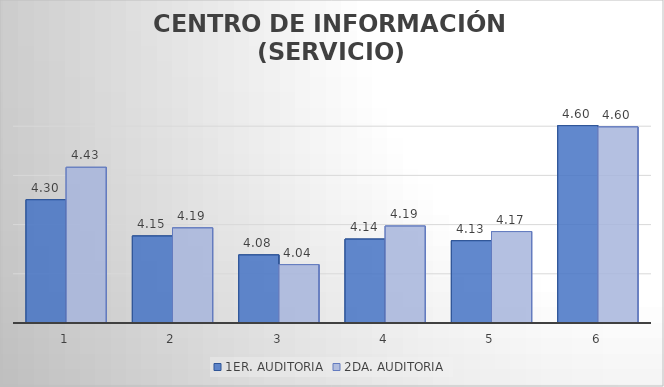
| Category | 1ER. AUDITORIA | 2DA. AUDITORIA |
|---|---|---|
| 0 | 4.301 | 4.433 |
| 1 | 4.154 | 4.187 |
| 2 | 4.077 | 4.037 |
| 3 | 4.141 | 4.194 |
| 4 | 4.135 | 4.172 |
| 5 | 4.603 | 4.597 |